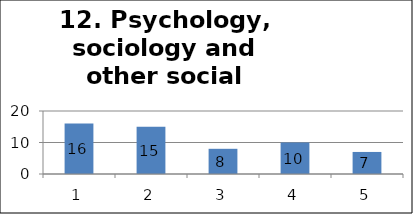
| Category | Series 1 |
|---|---|
| 0 | 16 |
| 1 | 15 |
| 2 | 8 |
| 3 | 10 |
| 4 | 7 |